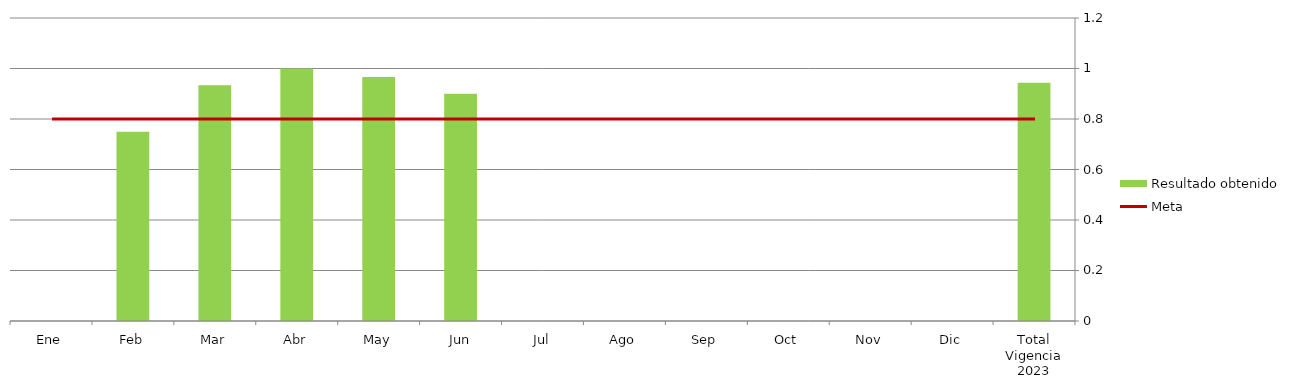
| Category | Resultado obtenido |
|---|---|
| Ene | 0 |
| Feb | 0.75 |
| Mar | 0.933 |
| Abr | 1 |
| May | 0.966 |
| Jun | 0.9 |
| Jul | 0 |
| Ago | 0 |
| Sep | 0 |
| Oct | 0 |
| Nov | 0 |
| Dic | 0 |
| Total Vigencia 2023 | 0.943 |